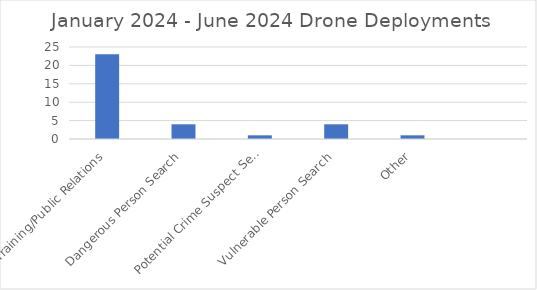
| Category | Series 0 |
|---|---|
| Training/Public Relations | 23 |
| Dangerous Person Search | 4 |
| Potential Crime Suspect Search | 1 |
| Vulnerable Person Search | 4 |
| Other | 1 |